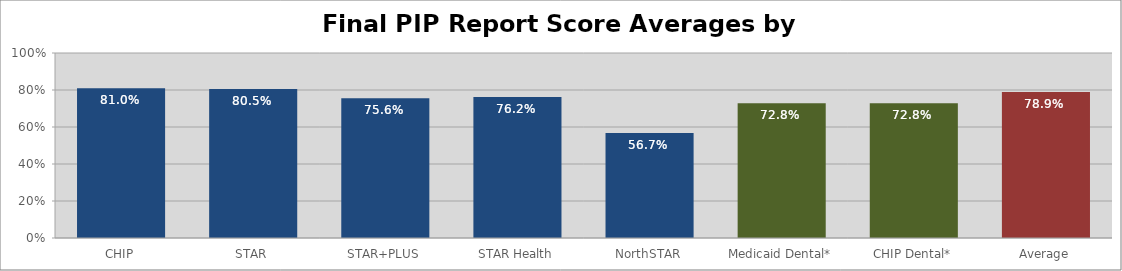
| Category | Final PIP Report
Averages |
|---|---|
| CHIP | 0.81 |
| STAR | 0.805 |
| STAR+PLUS | 0.756 |
| STAR Health | 0.762 |
| NorthSTAR | 0.567 |
| Medicaid Dental* | 0.728 |
| CHIP Dental* | 0.728 |
| Average | 0.789 |